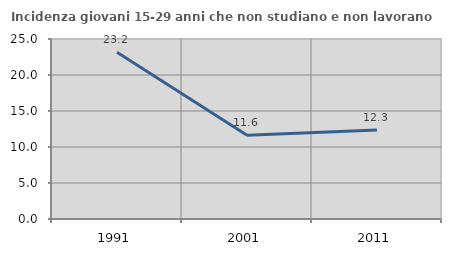
| Category | Incidenza giovani 15-29 anni che non studiano e non lavorano  |
|---|---|
| 1991.0 | 23.164 |
| 2001.0 | 11.64 |
| 2011.0 | 12.346 |